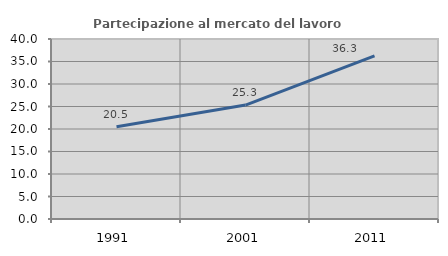
| Category | Partecipazione al mercato del lavoro  femminile |
|---|---|
| 1991.0 | 20.495 |
| 2001.0 | 25.323 |
| 2011.0 | 36.253 |